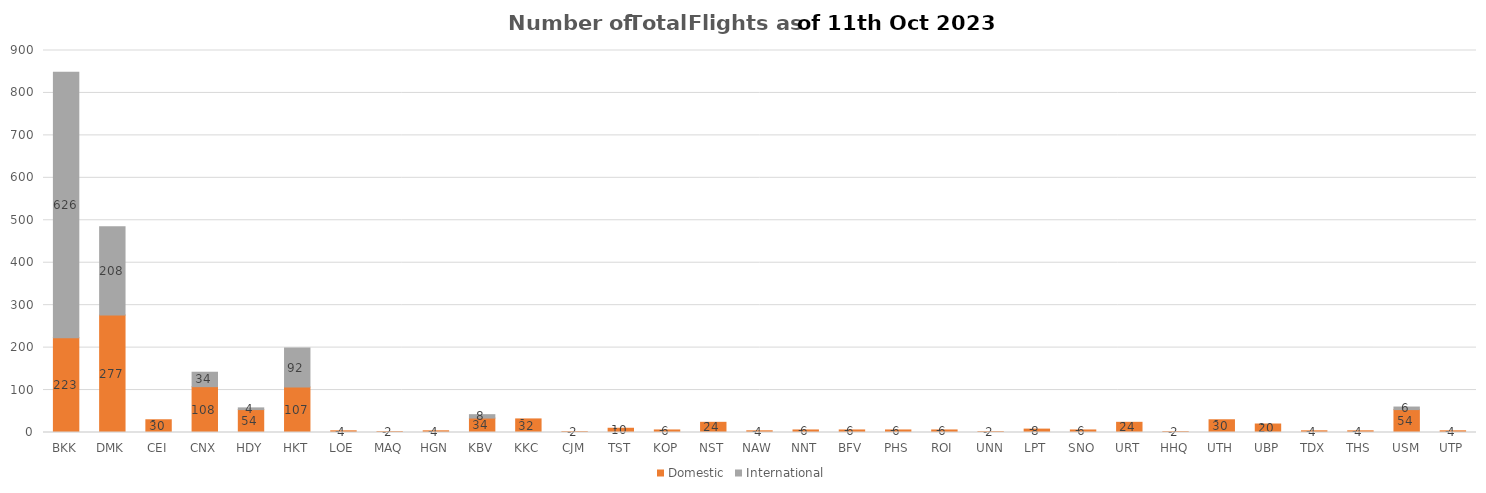
| Category | Domestic | International |
|---|---|---|
| BKK | 223 | 626 |
| DMK | 277 | 208 |
| CEI | 30 | 0 |
| CNX | 108 | 34 |
| HDY | 54 | 4 |
| HKT | 107 | 92 |
| LOE | 4 | 0 |
| MAQ | 2 | 0 |
| HGN | 4 | 0 |
| KBV | 34 | 8 |
| KKC | 32 | 0 |
| CJM | 2 | 0 |
| TST | 10 | 0 |
| KOP | 6 | 0 |
| NST | 24 | 0 |
| NAW | 4 | 0 |
| NNT | 6 | 0 |
| BFV | 6 | 0 |
| PHS | 6 | 0 |
| ROI | 6 | 0 |
| UNN | 2 | 0 |
| LPT | 8 | 0 |
| SNO | 6 | 0 |
| URT | 24 | 0 |
| HHQ | 2 | 0 |
| UTH | 30 | 0 |
| UBP | 20 | 0 |
| TDX | 4 | 0 |
| THS | 4 | 0 |
| USM | 54 | 6 |
| UTP | 4 | 0 |